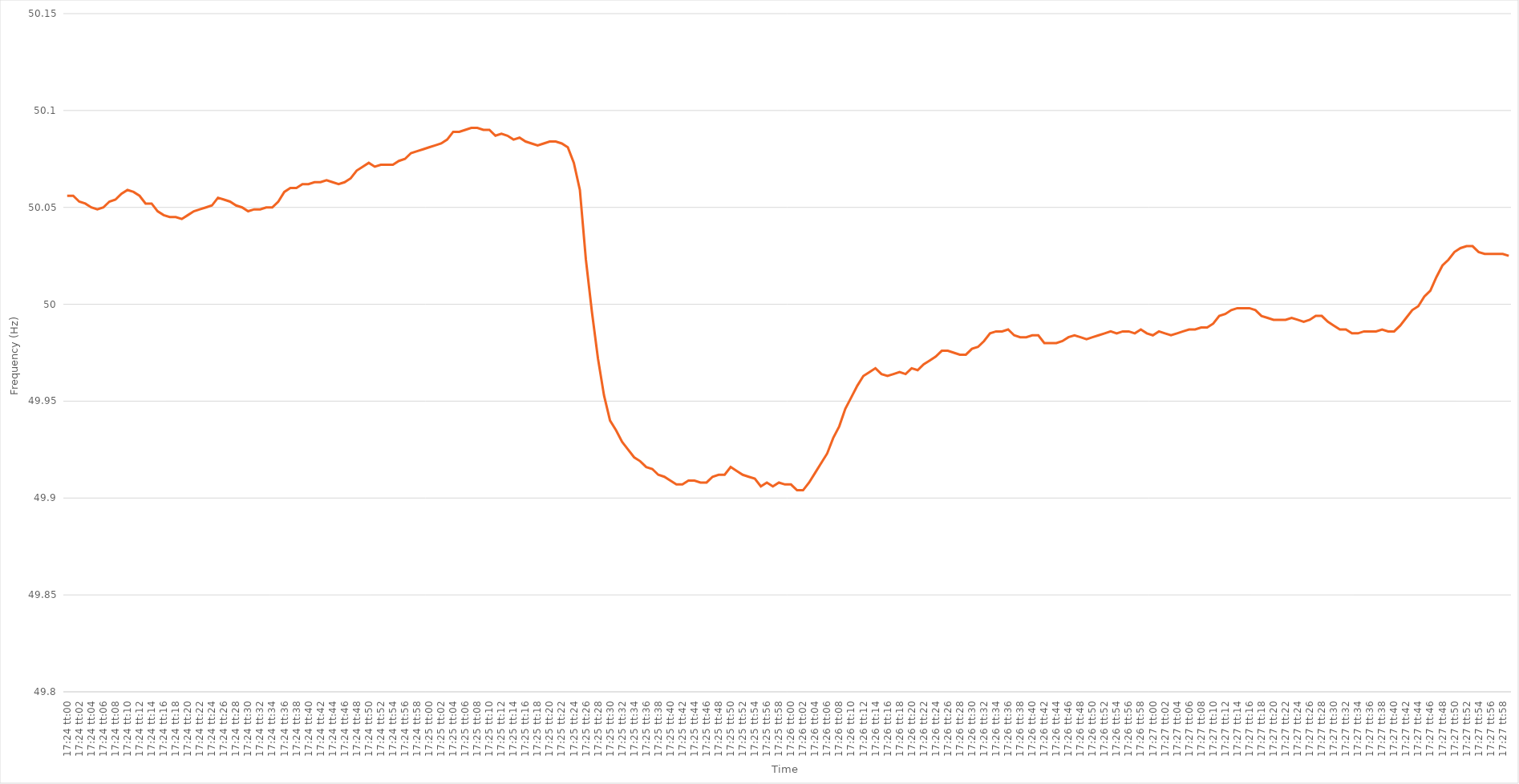
| Category | Series 0 |
|---|---|
| 0.725 | 50.056 |
| 0.725011574074074 | 50.056 |
| 0.7250231481481482 | 50.053 |
| 0.7250347222222223 | 50.052 |
| 0.7250462962962962 | 50.05 |
| 0.7250578703703704 | 50.049 |
| 0.7250694444444444 | 50.05 |
| 0.7250810185185186 | 50.053 |
| 0.7250925925925925 | 50.054 |
| 0.7251041666666667 | 50.057 |
| 0.7251157407407408 | 50.059 |
| 0.7251273148148148 | 50.058 |
| 0.7251388888888889 | 50.056 |
| 0.7251504629629629 | 50.052 |
| 0.7251620370370371 | 50.052 |
| 0.725173611111111 | 50.048 |
| 0.7251851851851852 | 50.046 |
| 0.7251967592592593 | 50.045 |
| 0.7252083333333333 | 50.045 |
| 0.7252199074074074 | 50.044 |
| 0.7252314814814814 | 50.046 |
| 0.7252430555555556 | 50.048 |
| 0.7252546296296297 | 50.049 |
| 0.7252662037037036 | 50.05 |
| 0.7252777777777778 | 50.051 |
| 0.7252893518518518 | 50.055 |
| 0.725300925925926 | 50.054 |
| 0.7253124999999999 | 50.053 |
| 0.7253240740740741 | 50.051 |
| 0.7253356481481482 | 50.05 |
| 0.7253472222222223 | 50.048 |
| 0.7253587962962963 | 50.049 |
| 0.7253703703703703 | 50.049 |
| 0.7253819444444445 | 50.05 |
| 0.7253935185185184 | 50.05 |
| 0.7254050925925926 | 50.053 |
| 0.7254166666666667 | 50.058 |
| 0.7254282407407407 | 50.06 |
| 0.7254398148148148 | 50.06 |
| 0.7254513888888888 | 50.062 |
| 0.725462962962963 | 50.062 |
| 0.7254745370370371 | 50.063 |
| 0.725486111111111 | 50.063 |
| 0.7254976851851852 | 50.064 |
| 0.7255092592592592 | 50.063 |
| 0.7255208333333334 | 50.062 |
| 0.7255324074074073 | 50.063 |
| 0.7255439814814815 | 50.065 |
| 0.7255555555555556 | 50.069 |
| 0.7255671296296297 | 50.071 |
| 0.7255787037037037 | 50.073 |
| 0.7255902777777777 | 50.071 |
| 0.7256018518518519 | 50.072 |
| 0.725613425925926 | 50.072 |
| 0.725625 | 50.072 |
| 0.7256365740740741 | 50.074 |
| 0.7256481481481482 | 50.075 |
| 0.7256597222222222 | 50.078 |
| 0.7256712962962962 | 50.079 |
| 0.7256828703703704 | 50.08 |
| 0.7256944444444445 | 50.081 |
| 0.7257060185185185 | 50.082 |
| 0.7257175925925926 | 50.083 |
| 0.7257291666666666 | 50.085 |
| 0.7257407407407408 | 50.089 |
| 0.7257523148148147 | 50.089 |
| 0.7257638888888889 | 50.09 |
| 0.725775462962963 | 50.091 |
| 0.7257870370370371 | 50.091 |
| 0.7257986111111111 | 50.09 |
| 0.7258101851851851 | 50.09 |
| 0.7258217592592593 | 50.087 |
| 0.7258333333333334 | 50.088 |
| 0.7258449074074074 | 50.087 |
| 0.7258564814814815 | 50.085 |
| 0.7258680555555556 | 50.086 |
| 0.7258796296296296 | 50.084 |
| 0.7258912037037036 | 50.083 |
| 0.7259027777777778 | 50.082 |
| 0.7259143518518519 | 50.083 |
| 0.7259259259259259 | 50.084 |
| 0.7259375 | 50.084 |
| 0.725949074074074 | 50.083 |
| 0.7259606481481482 | 50.081 |
| 0.7259722222222221 | 50.073 |
| 0.7259837962962963 | 50.059 |
| 0.7259953703703704 | 50.023 |
| 0.7260069444444445 | 49.996 |
| 0.7260185185185185 | 49.972 |
| 0.7260300925925925 | 49.953 |
| 0.7260416666666667 | 49.94 |
| 0.7260532407407408 | 49.935 |
| 0.7260648148148148 | 49.929 |
| 0.7260763888888889 | 49.925 |
| 0.726087962962963 | 49.921 |
| 0.726099537037037 | 49.919 |
| 0.726111111111111 | 49.916 |
| 0.7261226851851852 | 49.915 |
| 0.7261342592592593 | 49.912 |
| 0.7261458333333333 | 49.911 |
| 0.7261574074074074 | 49.909 |
| 0.7261689814814815 | 49.907 |
| 0.7261805555555556 | 49.907 |
| 0.7261921296296295 | 49.909 |
| 0.7262037037037037 | 49.909 |
| 0.7262152777777778 | 49.908 |
| 0.7262268518518519 | 49.908 |
| 0.7262384259259259 | 49.911 |
| 0.72625 | 49.912 |
| 0.7262615740740741 | 49.912 |
| 0.7262731481481483 | 49.916 |
| 0.7262847222222222 | 49.914 |
| 0.7262962962962963 | 49.912 |
| 0.7263078703703704 | 49.911 |
| 0.7263194444444444 | 49.91 |
| 0.7263310185185184 | 49.906 |
| 0.7263425925925926 | 49.908 |
| 0.7263541666666667 | 49.906 |
| 0.7263657407407407 | 49.908 |
| 0.7263773148148148 | 49.907 |
| 0.7263888888888889 | 49.907 |
| 0.726400462962963 | 49.904 |
| 0.7264120370370369 | 49.904 |
| 0.7264236111111111 | 49.908 |
| 0.7264351851851852 | 49.913 |
| 0.7264467592592593 | 49.918 |
| 0.7264583333333333 | 49.923 |
| 0.7264699074074074 | 49.931 |
| 0.7264814814814815 | 49.937 |
| 0.7264930555555557 | 49.946 |
| 0.7265046296296296 | 49.952 |
| 0.7265162037037037 | 49.958 |
| 0.7265277777777778 | 49.963 |
| 0.7265393518518519 | 49.965 |
| 0.7265509259259259 | 49.967 |
| 0.7265625 | 49.964 |
| 0.7265740740740741 | 49.963 |
| 0.7265856481481481 | 49.964 |
| 0.7265972222222222 | 49.965 |
| 0.7266087962962963 | 49.964 |
| 0.7266203703703704 | 49.967 |
| 0.7266319444444443 | 49.966 |
| 0.7266435185185185 | 49.969 |
| 0.7266550925925926 | 49.971 |
| 0.7266666666666667 | 49.973 |
| 0.7266782407407407 | 49.976 |
| 0.7266898148148148 | 49.976 |
| 0.7267013888888889 | 49.975 |
| 0.7267129629629631 | 49.974 |
| 0.726724537037037 | 49.974 |
| 0.7267361111111111 | 49.977 |
| 0.7267476851851852 | 49.978 |
| 0.7267592592592593 | 49.981 |
| 0.7267708333333333 | 49.985 |
| 0.7267824074074074 | 49.986 |
| 0.7267939814814816 | 49.986 |
| 0.7268055555555556 | 49.987 |
| 0.7268171296296296 | 49.984 |
| 0.7268287037037037 | 49.983 |
| 0.7268402777777778 | 49.983 |
| 0.7268518518518517 | 49.984 |
| 0.7268634259259259 | 49.984 |
| 0.726875 | 49.98 |
| 0.7268865740740741 | 49.98 |
| 0.7268981481481481 | 49.98 |
| 0.7269097222222222 | 49.981 |
| 0.7269212962962963 | 49.983 |
| 0.7269328703703705 | 49.984 |
| 0.7269444444444444 | 49.983 |
| 0.7269560185185185 | 49.982 |
| 0.7269675925925926 | 49.983 |
| 0.7269791666666667 | 49.984 |
| 0.7269907407407407 | 49.985 |
| 0.7270023148148148 | 49.986 |
| 0.727013888888889 | 49.985 |
| 0.727025462962963 | 49.986 |
| 0.727037037037037 | 49.986 |
| 0.7270486111111111 | 49.985 |
| 0.7270601851851852 | 49.987 |
| 0.7270717592592592 | 49.985 |
| 0.7270833333333333 | 49.984 |
| 0.7270949074074075 | 49.986 |
| 0.7271064814814815 | 49.985 |
| 0.7271180555555555 | 49.984 |
| 0.7271296296296296 | 49.985 |
| 0.7271412037037037 | 49.986 |
| 0.7271527777777779 | 49.987 |
| 0.7271643518518518 | 49.987 |
| 0.727175925925926 | 49.988 |
| 0.7271875 | 49.988 |
| 0.7271990740740741 | 49.99 |
| 0.7272106481481481 | 49.994 |
| 0.7272222222222222 | 49.995 |
| 0.7272337962962964 | 49.997 |
| 0.7272453703703704 | 49.998 |
| 0.7272569444444444 | 49.998 |
| 0.7272685185185185 | 49.998 |
| 0.7272800925925926 | 49.997 |
| 0.7272916666666666 | 49.994 |
| 0.7273032407407407 | 49.993 |
| 0.7273148148148149 | 49.992 |
| 0.7273263888888889 | 49.992 |
| 0.7273379629629629 | 49.992 |
| 0.727349537037037 | 49.993 |
| 0.7273611111111111 | 49.992 |
| 0.7273726851851853 | 49.991 |
| 0.7273842592592592 | 49.992 |
| 0.7273958333333334 | 49.994 |
| 0.7274074074074074 | 49.994 |
| 0.7274189814814815 | 49.991 |
| 0.7274305555555555 | 49.989 |
| 0.7274421296296296 | 49.987 |
| 0.7274537037037038 | 49.987 |
| 0.7274652777777778 | 49.985 |
| 0.7274768518518518 | 49.985 |
| 0.7274884259259259 | 49.986 |
| 0.7275 | 49.986 |
| 0.727511574074074 | 49.986 |
| 0.7275231481481481 | 49.987 |
| 0.7275347222222223 | 49.986 |
| 0.7275462962962963 | 49.986 |
| 0.7275578703703703 | 49.989 |
| 0.7275694444444444 | 49.993 |
| 0.7275810185185185 | 49.997 |
| 0.7275925925925927 | 49.999 |
| 0.7276041666666666 | 50.004 |
| 0.7276157407407408 | 50.007 |
| 0.7276273148148148 | 50.014 |
| 0.727638888888889 | 50.02 |
| 0.7276504629629629 | 50.023 |
| 0.727662037037037 | 50.027 |
| 0.7276736111111112 | 50.029 |
| 0.7276851851851852 | 50.03 |
| 0.7276967592592593 | 50.03 |
| 0.7277083333333333 | 50.027 |
| 0.7277199074074074 | 50.026 |
| 0.7277314814814816 | 50.026 |
| 0.7277430555555555 | 50.026 |
| 0.7277546296296297 | 50.026 |
| 0.7277662037037037 | 50.025 |